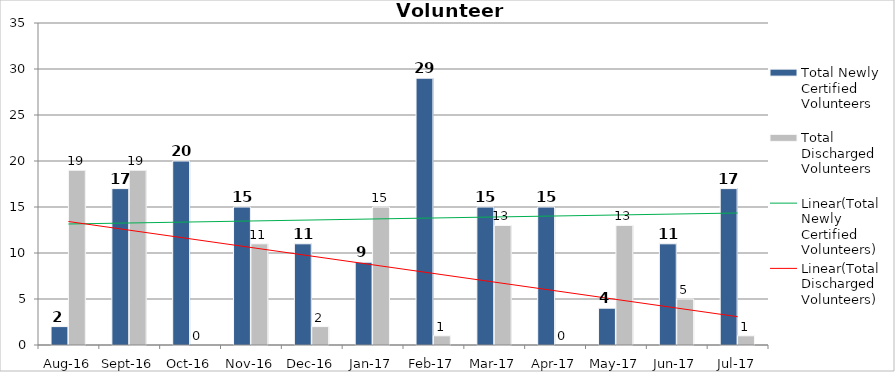
| Category | Total Newly Certified Volunteers | Total Discharged Volunteers |
|---|---|---|
| Aug-16 | 2 | 19 |
| Sep-16 | 17 | 19 |
| Oct-16 | 20 | 0 |
| Nov-16 | 15 | 11 |
| Dec-16 | 11 | 2 |
| Jan-17 | 9 | 15 |
| Feb-17 | 29 | 1 |
| Mar-17 | 15 | 13 |
| Apr-17 | 15 | 0 |
| May-17 | 4 | 13 |
| Jun-17 | 11 | 5 |
| Jul-17 | 17 | 1 |